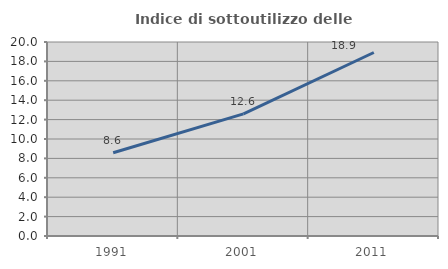
| Category | Indice di sottoutilizzo delle abitazioni  |
|---|---|
| 1991.0 | 8.587 |
| 2001.0 | 12.596 |
| 2011.0 | 18.919 |